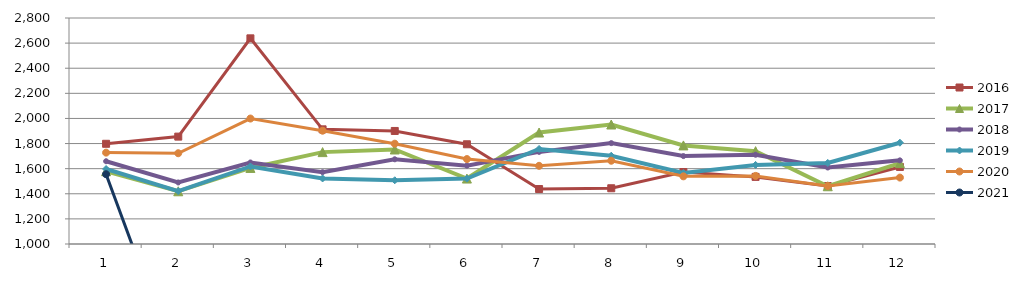
| Category | 2015 | 2016 | 2017 | 2018 | 2019 | 2020 | 2021 |
|---|---|---|---|---|---|---|---|
| 0 |  | 1798.146 | 1579.519 | 1659.233 | 1597.182 | 1727.767 | 1555.724 |
| 1 |  | 1855.266 | 1419.892 | 1490.116 | 1420.981 | 1722.949 | 0 |
| 2 |  | 2637.962 | 1605.876 | 1649.429 | 1617.601 | 1999.15 | 0 |
| 3 |  | 1913.237 | 1731.762 | 1571.732 | 1521.999 | 1902.268 | 0 |
| 4 |  | 1900.309 | 1752.669 | 1674.727 | 1507.654 | 1798.925 | 0 |
| 5 |  | 1794.333 | 1521.303 | 1624.201 | 1521.033 | 1676.477 | 0 |
| 6 |  | 1437.75 | 1887.908 | 1733.621 | 1757.049 | 1622.712 | 0 |
| 7 |  | 1443.965 | 1951.735 | 1803.444 | 1702.894 | 1663.262 | 0 |
| 8 |  | 1573.366 | 1785.145 | 1700.265 | 1565.361 | 1539.017 | 0 |
| 9 |  | 1534.523 | 1739.554 | 1710.862 | 1629.894 | 1542.307 | 0 |
| 10 |  | 1461.686 | 1460 | 1609.178 | 1645.62 | 1461.483 | 0 |
| 11 |  | 1613.843 | 1644.49 | 1666.129 | 1806.739 | 1529.116 | 0 |